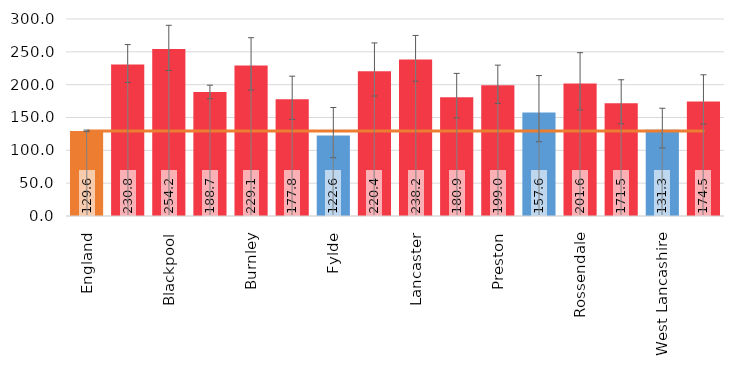
| Category | Value |
|---|---|
| England | 129.631 |
| Blackburn with Darwen | 230.846 |
| Blackpool | 254.247 |
| Lancashire-12 | 188.696 |
| Burnley | 229.113 |
| Chorley | 177.818 |
| Fylde | 122.647 |
| Hyndburn | 220.426 |
| Lancaster | 238.247 |
| Pendle | 180.903 |
| Preston | 198.994 |
| Ribble Valley | 157.632 |
| Rossendale | 201.622 |
| South Ribble | 171.549 |
| West Lancashire | 131.287 |
| Wyre | 174.499 |